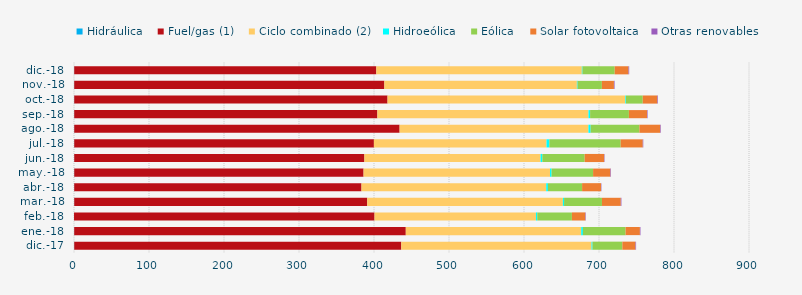
| Category | Hidráulica | Fuel/gas (1) | Ciclo combinado (2) | Hidroeólica | Eólica | Solar fotovoltaica | Otras renovables |
|---|---|---|---|---|---|---|---|
| dic.-17 | 0.311 | 436.048 | 253.67 | 1.286 | 39.81 | 17.54 | 0.782 |
| ene.-18 | 0.279 | 442.105 | 233.902 | 2.258 | 56.908 | 19.073 | 0.762 |
| feb.-18 | 0.034 | 400.679 | 215.217 | 1.754 | 46.206 | 17.886 | 0.647 |
| mar.-18 | 0.31 | 390.68 | 260.839 | 1.6 | 50.516 | 25.105 | 0.837 |
| abr.-18 | 0.276 | 383.044 | 246.338 | 2.263 | 45.546 | 25.211 | 0.539 |
| may.-18 | 0.308 | 385.794 | 248.617 | 2.034 | 55.352 | 23.08 | 0.751 |
| jun.-18 | 0.294 | 386.903 | 234.948 | 2.322 | 56.421 | 25.993 | 0.531 |
| jul.-18 | 0.296 | 399.578 | 230.146 | 3.716 | 95.158 | 29.45 | 0.702 |
| ago.-18 | 0.308 | 433.847 | 251.789 | 2.859 | 65.081 | 27.718 | 0.816 |
| sep.-18 | 0.288 | 404.236 | 281.475 | 2.166 | 51.688 | 24.128 | 0.783 |
| oct.-18 | 0.297 | 417.763 | 317.069 | 0.873 | 22.336 | 19.456 | 0.813 |
| nov.-18 | 0.289 | 413.521 | 256.697 | 0.901 | 32.427 | 16.089 | 0.85 |
| dic.-18 | 0.296 | 402.8 | 273.986 | 0.91 | 42.932 | 18.423 | 0.899 |